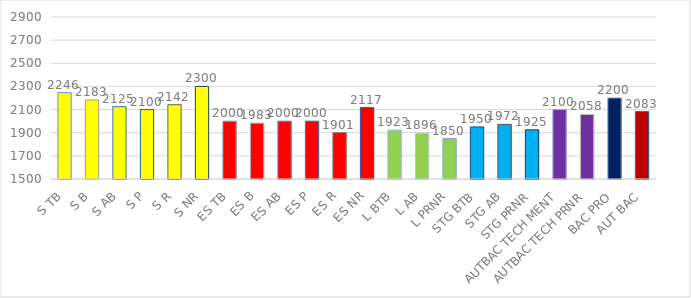
| Category | Series 0 |
|---|---|
|  S TB | 2246 |
| S B | 2183 |
| S AB | 2125 |
| S P | 2100 |
| S R | 2142 |
| S NR | 2300 |
| ES TB | 2000 |
| ES B | 1983 |
| ES AB | 2000 |
| ES P | 2000 |
| ES R | 1901 |
| ES NR | 2117 |
| L BTB | 1923 |
| L AB | 1896 |
| L PRNR | 1850 |
| STG BTB | 1950 |
| STG AB | 1972 |
| STG PRNR | 1925 |
| AUTBAC TECH MENT | 2100 |
| AUTBAC TECH PRNR | 2058 |
| BAC PRO | 2200 |
| AUT BAC | 2083 |